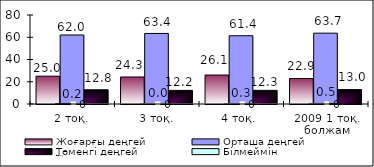
| Category | Жоғарғы деңгей | Орташа деңгей | Төменгі деңгей |
|---|---|---|---|
| 2 тоқ. | 25 | 62.02 | 12.79 |
| 3 тоқ. | 24.29 | 63.42 | 12.24 |
| 4 тоқ.  | 26.05 | 61.37 | 12.27 |
| 2009 1 тоқ. болжам | 22.9 | 63.67 | 12.95 |